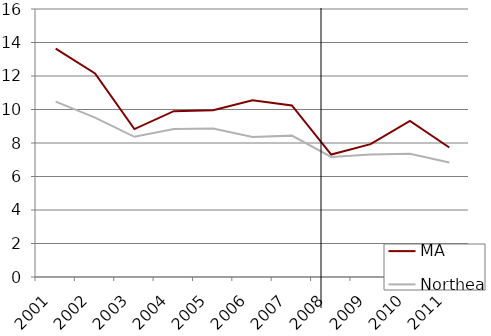
| Category | MA | Northeast |
|---|---|---|
| 2001.0 | 13.63 | 10.47 |
| 2002.0 | 12.15 | 9.52 |
| 2003.0 | 8.83 | 8.37 |
| 2004.0 | 9.9 | 8.83 |
| 2005.0 | 9.96 | 8.86 |
| 2006.0 | 10.55 | 8.36 |
| 2007.0 | 10.24 | 8.44 |
| 2008.0 | 7.31 | 7.17 |
| 2009.0 | 7.93 | 7.31 |
| 2010.0 | 9.32 | 7.36 |
| 2011.0 | 7.73 | 6.83 |